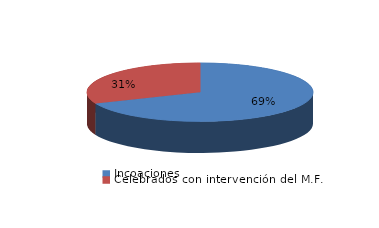
| Category | Series 0 |
|---|---|
| Incoaciones | 3517 |
| Celebrados con intervención del M.F. | 1601 |